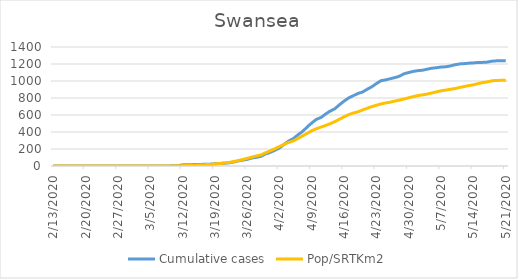
| Category | Cumulative cases | Pop/SRTKm2 |
|---|---|---|
| 5/21/20 | 1237 | 1007.399 |
| 5/20/20 | 1237 | 1007.399 |
| 5/19/20 | 1237 | 1007.162 |
| 5/18/20 | 1233 | 1001.641 |
| 5/17/20 | 1222 | 989.887 |
| 5/16/20 | 1219 | 981.131 |
| 5/15/20 | 1218 | 968.826 |
| 5/14/20 | 1213 | 955.179 |
| 5/13/20 | 1210 | 945.713 |
| 5/12/20 | 1204 | 934.828 |
| 5/11/20 | 1201 | 924.021 |
| 5/10/20 | 1191 | 910.611 |
| 5/9/20 | 1177 | 902.802 |
| 5/8/20 | 1167 | 893.02 |
| 5/7/20 | 1164 | 885.132 |
| 5/6/20 | 1156 | 872.117 |
| 5/5/20 | 1150 | 859.101 |
| 5/4/20 | 1139 | 846.559 |
| 5/3/20 | 1127 | 836.462 |
| 5/2/20 | 1122 | 829.047 |
| 5/1/20 | 1113 | 815.874 |
| 4/30/20 | 1100 | 803.411 |
| 4/29/20 | 1085 | 788.265 |
| 4/28/20 | 1057 | 775.408 |
| 4/27/20 | 1040 | 763.891 |
| 4/26/20 | 1027 | 750.954 |
| 4/25/20 | 1013 | 741.567 |
| 4/24/20 | 1004 | 730.918 |
| 4/23/20 | 970 | 714.59 |
| 4/22/20 | 932 | 698.971 |
| 4/21/20 | 903 | 679.172 |
| 4/20/20 | 870 | 659.215 |
| 4/19/20 | 854 | 637.522 |
| 4/18/20 | 827 | 623.481 |
| 4/17/20 | 801 | 604.313 |
| 4/16/20 | 764 | 578.913 |
| 4/15/20 | 721 | 550.595 |
| 4/14/20 | 674 | 522.592 |
| 4/13/20 | 647 | 498.138 |
| 4/12/20 | 612 | 477.077 |
| 4/11/20 | 571 | 457.909 |
| 4/10/20 | 549 | 438.661 |
| 4/9/20 | 507 | 414.997 |
| 4/8/20 | 459 | 384.233 |
| 4/7/20 | 406 | 354.021 |
| 4/6/20 | 367 | 324.362 |
| 4/5/20 | 322 | 294.466 |
| 4/4/20 | 294 | 277.033 |
| 4/3/20 | 255 | 254.867 |
| 4/2/20 | 212 | 229.309 |
| 4/1/20 | 185 | 203.042 |
| 3/31/20 | 160 | 177.799 |
| 3/30/20 | 143 | 156.423 |
| 3/29/20 | 114 | 130.076 |
| 3/28/20 | 102 | 117.77 |
| 3/27/20 | 94 | 104.676 |
| 3/26/20 | 78 | 90.083 |
| 3/25/20 | 69 | 76.358 |
| 3/24/20 | 59 | 61.922 |
| 3/23/20 | 46 | 51.273 |
| 3/22/20 | 37 | 41.019 |
| 3/21/20 | 32 | 35.024 |
| 3/20/20 | 30 | 29.107 |
| 3/19/20 | 26 | 23.428 |
| 3/18/20 | 22 | 18.695 |
| 3/17/20 | 20 | 15.934 |
| 3/16/20 | 19 | 13.015 |
| 3/15/20 | 17 | 10.334 |
| 3/14/20 | 16 | 8.046 |
| 3/13/20 | 16 | 6.547 |
| 3/12/20 | 13 | 4.417 |
| 3/11/20 | 4 | 2.524 |
| 3/10/20 | 2 | 1.42 |
| 3/9/20 | 1 | 0.552 |
| 3/8/20 | 1 | 0.316 |
| 3/7/20 | 1 | 0.316 |
| 3/6/20 | 1 | 0.158 |
| 3/5/20 | 1 | 0.158 |
| 3/4/20 | 1 | 0.158 |
| 3/3/20 | 1 | 0.079 |
| 3/2/20 | 1 | 0.079 |
| 3/1/20 | 1 | 0.079 |
| 2/29/20 | 1 | 0.079 |
| 2/28/20 | 1 | 0.079 |
| 2/27/20 | 1 | 0.079 |
| 2/26/20 | 0 | 0 |
| 2/25/20 | 0 | 0 |
| 2/24/20 | 0 | 0 |
| 2/23/20 | 0 | 0 |
| 2/22/20 | 0 | 0 |
| 2/21/20 | 0 | 0 |
| 2/20/20 | 0 | 0 |
| 2/19/20 | 0 | 0 |
| 2/18/20 | 0 | 0 |
| 2/17/20 | 0 | 0 |
| 2/16/20 | 0 | 0 |
| 2/15/20 | 0 | 0 |
| 2/14/20 | 0 | 0 |
| 2/13/20 | 0 | 0 |